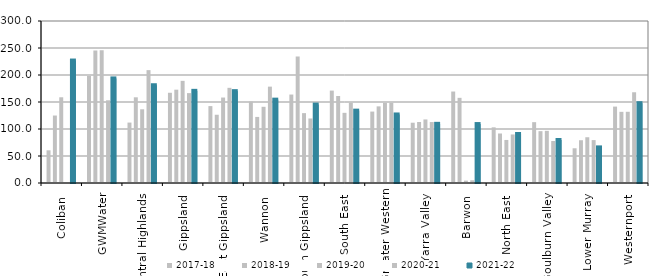
| Category | 2017-18 | 2018-19 | 2019-20 | 2020-21 | 2021-22 |
|---|---|---|---|---|---|
| Coliban  | 60.543 | 124.935 | 158.741 | 0 | 226.778 |
| GWMWater | 198.255 | 245.297 | 245.831 | 153.166 | 193.66 |
| Central Highlands  | 111.895 | 158.693 | 136.502 | 209.032 | 181.041 |
| Gippsland  | 167.081 | 172.801 | 189.169 | 166.448 | 170.659 |
| East Gippsland  | 142.403 | 126.374 | 158.246 | 176.231 | 170.107 |
| Wannon  | 150.822 | 122.348 | 141.117 | 178.445 | 154.361 |
| South Gippsland  | 163.803 | 234.275 | 129.384 | 119.479 | 145.223 |
| South East  | 171.116 | 161.137 | 129.935 | 148.86 | 133.983 |
| Greater Western | 132.26 | 141.899 | 148.409 | 148.58 | 126.913 |
| Yarra Valley  | 111.628 | 112.986 | 117.7 | 112.876 | 109.575 |
| Barwon  | 169.387 | 157.723 | 4.398 | 5.042 | 109.159 |
| North East  | 103.092 | 91.67 | 79.709 | 89.881 | 90.749 |
| Goulburn Valley  | 112.663 | 95.988 | 96.581 | 77.732 | 79.641 |
| Lower Murray  | 64.316 | 79.198 | 84.738 | 79.448 | 65.927 |
| Westernport  | 141.492 | 131.803 | 131.888 | 168.045 | 147.814 |